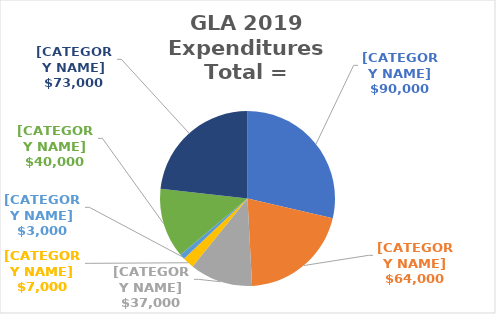
| Category | Series 0 |
|---|---|
| Water Quality | 89856 |
| Swimmers Itch | 64461 |
| Invasive Species | 36545 |
| Guardian | 6674 |
| Water Level | 3070 |
| Member Communications | 40327 |
| Administrative | 72938 |